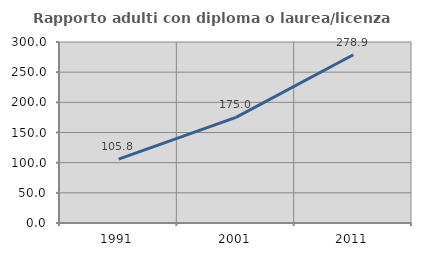
| Category | Rapporto adulti con diploma o laurea/licenza media  |
|---|---|
| 1991.0 | 105.769 |
| 2001.0 | 175 |
| 2011.0 | 278.947 |